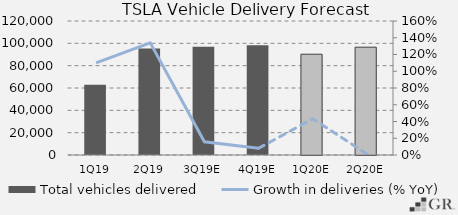
| Category | Total vehicles delivered  |
|---|---|
|  1Q19  | 63019 |
|  2Q19  | 95356 |
|  3Q19E  | 97000 |
|  4Q19E  | 98292.5 |
|  1Q20E  | 90255.475 |
|  2Q20E  | 96561.744 |